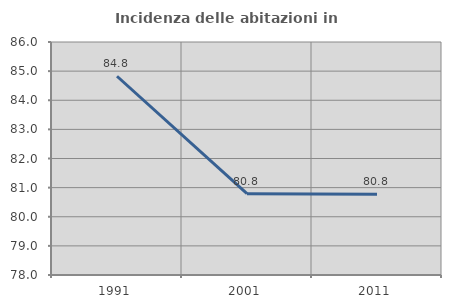
| Category | Incidenza delle abitazioni in proprietà  |
|---|---|
| 1991.0 | 84.824 |
| 2001.0 | 80.791 |
| 2011.0 | 80.769 |